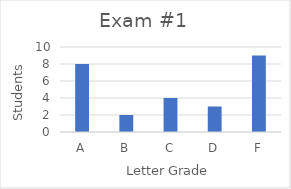
| Category | Series 0 |
|---|---|
| A | 8 |
| B | 2 |
| C | 4 |
| D | 3 |
| F | 9 |